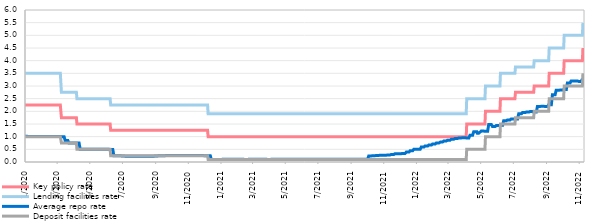
| Category | Key policy rate | Lending facilities rate | Average repo rate | Deposit facilities rate |
|---|---|---|---|---|
| 2020-01-03 | 2.25 | 3.5 | 1.02 | 1 |
| 2020-01-06 | 2.25 | 3.5 | 1.02 | 1 |
| 2020-01-08 | 2.25 | 3.5 | 1.01 | 1 |
| 2020-01-09 | 2.25 | 3.5 | 1.01 | 1 |
| 2020-01-10 | 2.25 | 3.5 | 1.01 | 1 |
| 2020-01-13 | 2.25 | 3.5 | 1.01 | 1 |
| 2020-01-14 | 2.25 | 3.5 | 1.01 | 1 |
| 2020-01-15 | 2.25 | 3.5 | 1.01 | 1 |
| 2020-01-16 | 2.25 | 3.5 | 1.01 | 1 |
| 2020-01-17 | 2.25 | 3.5 | 1.01 | 1 |
| 2020-01-20 | 2.25 | 3.5 | 1.01 | 1 |
| 2020-01-21 | 2.25 | 3.5 | 1.01 | 1 |
| 2020-01-22 | 2.25 | 3.5 | 1.01 | 1 |
| 2020-01-23 | 2.25 | 3.5 | 1.01 | 1 |
| 2020-01-24 | 2.25 | 3.5 | 1.01 | 1 |
| 2020-01-27 | 2.25 | 3.5 | 1.01 | 1 |
| 2020-01-28 | 2.25 | 3.5 | 1.01 | 1 |
| 2020-01-29 | 2.25 | 3.5 | 1.01 | 1 |
| 2020-01-30 | 2.25 | 3.5 | 1.01 | 1 |
| 2020-01-31 | 2.25 | 3.5 | 1.01 | 1 |
| 2020-02-03 | 2.25 | 3.5 | 1.01 | 1 |
| 2020-02-04 | 2.25 | 3.5 | 1.01 | 1 |
| 2020-02-05 | 2.25 | 3.5 | 1.01 | 1 |
| 2020-02-06 | 2.25 | 3.5 | 1.01 | 1 |
| 2020-02-07 | 2.25 | 3.5 | 1.01 | 1 |
| 2020-02-10 | 2.25 | 3.5 | 1.01 | 1 |
| 2020-02-11 | 2.25 | 3.5 | 1.01 | 1 |
| 2020-02-12 | 2.25 | 3.5 | 1.01 | 1 |
| 2020-02-13 | 2.25 | 3.5 | 1.01 | 1 |
| 2020-02-14 | 2.25 | 3.5 | 1.01 | 1 |
| 2020-02-18 | 2.25 | 3.5 | 1.01 | 1 |
| 2020-02-19 | 2.25 | 3.5 | 1.01 | 1 |
| 2020-02-20 | 2.25 | 3.5 | 1.01 | 1 |
| 2020-02-21 | 2.25 | 3.5 | 1.01 | 1 |
| 2020-02-24 | 2.25 | 3.5 | 1.01 | 1 |
| 2020-02-25 | 2.25 | 3.5 | 1.01 | 1 |
| 2020-02-26 | 2.25 | 3.5 | 1.01 | 1 |
| 2020-02-27 | 2.25 | 3.5 | 1.01 | 1 |
| 2020-02-28 | 2.25 | 3.5 | 1.01 | 1 |
| 2020-03-02 | 2.25 | 3.5 | 1.01 | 1 |
| 2020-03-03 | 2.25 | 3.5 | 1.01 | 1 |
| 2020-03-04 | 2.25 | 3.5 | 1.01 | 1 |
| 2020-03-05 | 2.25 | 3.5 | 1.01 | 1 |
| 2020-03-06 | 2.25 | 3.5 | 1.01 | 1 |
| 2020-03-09 | 2.25 | 3.5 | 1.01 | 1 |
| 2020-03-10 | 2.25 | 3.5 | 1.01 | 1 |
| 2020-03-11 | 1.75 | 2.75 | 1 | 0.75 |
| 2020-03-12 | 1.75 | 2.75 | 1 | 0.75 |
| 2020-03-13 | 1.75 | 2.75 | 1 | 0.75 |
| 2020-03-16 | 1.75 | 2.75 | 1 | 0.75 |
| 2020-03-17 | 1.75 | 2.75 | 1 | 0.75 |
| 2020-03-18 | 1.75 | 2.75 | 0.85 | 0.75 |
| 2020-03-19 | 1.75 | 2.75 | 0.85 | 0.75 |
| 2020-03-20 | 1.75 | 2.75 | 0.85 | 0.75 |
| 2020-03-23 | 1.75 | 2.75 | 0.85 | 0.75 |
| 2020-03-24 | 1.75 | 2.75 | 0.85 | 0.75 |
| 2020-03-25 | 1.75 | 2.75 | 0.75 | 0.75 |
| 2020-03-26 | 1.75 | 2.75 | 0.75 | 0.75 |
| 2020-03-27 | 1.75 | 2.75 | 0.75 | 0.75 |
| 2020-03-30 | 1.75 | 2.75 | 0.75 | 0.75 |
| 2020-03-31 | 1.75 | 2.75 | 0.75 | 0.75 |
| 2020-04-01 | 1.75 | 2.75 | 0.75 | 0.75 |
| 2020-04-02 | 1.75 | 2.75 | 0.75 | 0.75 |
| 2020-04-03 | 1.75 | 2.75 | 0.75 | 0.75 |
| 2020-04-06 | 1.75 | 2.75 | 0.75 | 0.75 |
| 2020-04-07 | 1.75 | 2.75 | 0.75 | 0.75 |
| 2020-04-08 | 1.75 | 2.75 | 0.75 | 0.75 |
| 2020-04-09 | 1.5 | 2.5 | 0.75 | 0.5 |
| 2020-04-10 | 1.5 | 2.5 | 0.75 | 0.5 |
| 2020-04-13 | 1.5 | 2.5 | 0.75 | 0.5 |
| 2020-04-14 | 1.5 | 2.5 | 0.75 | 0.5 |
| 2020-04-15 | 1.5 | 2.5 | 0.5 | 0.5 |
| 2020-04-16 | 1.5 | 2.5 | 0.5 | 0.5 |
| 2020-04-21 | 1.5 | 2.5 | 0.5 | 0.5 |
| 2020-04-22 | 1.5 | 2.5 | 0.5 | 0.5 |
| 2020-04-23 | 1.5 | 2.5 | 0.5 | 0.5 |
| 2020-04-24 | 1.5 | 2.5 | 0.5 | 0.5 |
| 2020-04-27 | 1.5 | 2.5 | 0.5 | 0.5 |
| 2020-04-28 | 1.5 | 2.5 | 0.5 | 0.5 |
| 2020-04-29 | 1.5 | 2.5 | 0.5 | 0.5 |
| 2020-04-30 | 1.5 | 2.5 | 0.5 | 0.5 |
| 2020-05-04 | 1.5 | 2.5 | 0.5 | 0.5 |
| 2020-05-05 | 1.5 | 2.5 | 0.5 | 0.5 |
| 2020-05-06 | 1.5 | 2.5 | 0.5 | 0.5 |
| 2020-05-07 | 1.5 | 2.5 | 0.5 | 0.5 |
| 2020-05-08 | 1.5 | 2.5 | 0.5 | 0.5 |
| 2020-05-11 | 1.5 | 2.5 | 0.5 | 0.5 |
| 2020-05-12 | 1.5 | 2.5 | 0.5 | 0.5 |
| 2020-05-13 | 1.5 | 2.5 | 0.5 | 0.5 |
| 2020-05-14 | 1.5 | 2.5 | 0.5 | 0.5 |
| 2020-05-15 | 1.5 | 2.5 | 0.5 | 0.5 |
| 2020-05-18 | 1.5 | 2.5 | 0.5 | 0.5 |
| 2020-05-19 | 1.5 | 2.5 | 0.5 | 0.5 |
| 2020-05-20 | 1.5 | 2.5 | 0.5 | 0.5 |
| 2020-05-21 | 1.5 | 2.5 | 0.5 | 0.5 |
| 2020-05-22 | 1.5 | 2.5 | 0.5 | 0.5 |
| 2020-05-25 | 1.5 | 2.5 | 0.5 | 0.5 |
| 2020-05-26 | 1.5 | 2.5 | 0.5 | 0.5 |
| 2020-05-27 | 1.5 | 2.5 | 0.5 | 0.5 |
| 2020-05-28 | 1.5 | 2.5 | 0.5 | 0.5 |
| 2020-05-29 | 1.5 | 2.5 | 0.5 | 0.5 |
| 2020-06-01 | 1.5 | 2.5 | 0.5 | 0.5 |
| 2020-06-02 | 1.5 | 2.5 | 0.5 | 0.5 |
| 2020-06-03 | 1.5 | 2.5 | 0.5 | 0.5 |
| 2020-06-04 | 1.5 | 2.5 | 0.5 | 0.5 |
| 2020-06-05 | 1.5 | 2.5 | 0.5 | 0.5 |
| 2020-06-08 | 1.5 | 2.5 | 0.5 | 0.5 |
| 2020-06-09 | 1.5 | 2.5 | 0.5 | 0.5 |
| 2020-06-10 | 1.5 | 2.5 | 0.49 | 0.5 |
| 2020-06-11 | 1.25 | 2.25 | 0.49 | 0.25 |
| 2020-06-12 | 1.25 | 2.25 | 0.49 | 0.25 |
| 2020-06-15 | 1.25 | 2.25 | 0.49 | 0.25 |
| 2020-06-16 | 1.25 | 2.25 | 0.49 | 0.25 |
| 2020-06-17 | 1.25 | 2.25 | 0.25 | 0.25 |
| 2020-06-18 | 1.25 | 2.25 | 0.25 | 0.25 |
| 2020-06-19 | 1.25 | 2.25 | 0.25 | 0.25 |
| 2020-06-22 | 1.25 | 2.25 | 0.25 | 0.25 |
| 2020-06-23 | 1.25 | 2.25 | 0.25 | 0.25 |
| 2020-06-24 | 1.25 | 2.25 | 0.25 | 0.25 |
| 2020-06-25 | 1.25 | 2.25 | 0.25 | 0.25 |
| 2020-06-26 | 1.25 | 2.25 | 0.25 | 0.25 |
| 2020-06-29 | 1.25 | 2.25 | 0.25 | 0.25 |
| 2020-06-30 | 1.25 | 2.25 | 0.25 | 0.25 |
| 2020-07-01 | 1.25 | 2.25 | 0.24 | 0.25 |
| 2020-07-02 | 1.25 | 2.25 | 0.24 | 0.25 |
| 2020-07-03 | 1.25 | 2.25 | 0.24 | 0.25 |
| 2020-07-06 | 1.25 | 2.25 | 0.24 | 0.25 |
| 2020-07-07 | 1.25 | 2.25 | 0.24 | 0.25 |
| 2020-07-08 | 1.25 | 2.25 | 0.23 | 0.25 |
| 2020-07-09 | 1.25 | 2.25 | 0.23 | 0.25 |
| 2020-07-10 | 1.25 | 2.25 | 0.23 | 0.25 |
| 2020-07-13 | 1.25 | 2.25 | 0.23 | 0.25 |
| 2020-07-14 | 1.25 | 2.25 | 0.23 | 0.25 |
| 2020-07-15 | 1.25 | 2.25 | 0.23 | 0.25 |
| 2020-07-16 | 1.25 | 2.25 | 0.23 | 0.25 |
| 2020-07-17 | 1.25 | 2.25 | 0.23 | 0.25 |
| 2020-07-20 | 1.25 | 2.25 | 0.23 | 0.25 |
| 2020-07-21 | 1.25 | 2.25 | 0.23 | 0.25 |
| 2020-07-22 | 1.25 | 2.25 | 0.23 | 0.25 |
| 2020-07-23 | 1.25 | 2.25 | 0.23 | 0.25 |
| 2020-07-24 | 1.25 | 2.25 | 0.23 | 0.25 |
| 2020-07-27 | 1.25 | 2.25 | 0.23 | 0.25 |
| 2020-07-28 | 1.25 | 2.25 | 0.23 | 0.25 |
| 2020-07-29 | 1.25 | 2.25 | 0.23 | 0.25 |
| 2020-07-30 | 1.25 | 2.25 | 0.23 | 0.25 |
| 2020-07-31 | 1.25 | 2.25 | 0.23 | 0.25 |
| 2020-08-03 | 1.25 | 2.25 | 0.23 | 0.25 |
| 2020-08-04 | 1.25 | 2.25 | 0.23 | 0.25 |
| 2020-08-05 | 1.25 | 2.25 | 0.23 | 0.25 |
| 2020-08-06 | 1.25 | 2.25 | 0.23 | 0.25 |
| 2020-08-07 | 1.25 | 2.25 | 0.23 | 0.25 |
| 2020-08-10 | 1.25 | 2.25 | 0.23 | 0.25 |
| 2020-08-11 | 1.25 | 2.25 | 0.23 | 0.25 |
| 2020-08-12 | 1.25 | 2.25 | 0.23 | 0.25 |
| 2020-08-13 | 1.25 | 2.25 | 0.23 | 0.25 |
| 2020-08-14 | 1.25 | 2.25 | 0.23 | 0.25 |
| 2020-08-17 | 1.25 | 2.25 | 0.23 | 0.25 |
| 2020-08-18 | 1.25 | 2.25 | 0.23 | 0.25 |
| 2020-08-19 | 1.25 | 2.25 | 0.23 | 0.25 |
| 2020-08-20 | 1.25 | 2.25 | 0.23 | 0.25 |
| 2020-08-21 | 1.25 | 2.25 | 0.23 | 0.25 |
| 2020-08-24 | 1.25 | 2.25 | 0.23 | 0.25 |
| 2020-08-25 | 1.25 | 2.25 | 0.23 | 0.25 |
| 2020-08-26 | 1.25 | 2.25 | 0.23 | 0.25 |
| 2020-08-27 | 1.25 | 2.25 | 0.23 | 0.25 |
| 2020-08-28 | 1.25 | 2.25 | 0.23 | 0.25 |
| 2020-08-31 | 1.25 | 2.25 | 0.23 | 0.25 |
| 2020-09-01 | 1.25 | 2.25 | 0.23 | 0.25 |
| 2020-09-02 | 1.25 | 2.25 | 0.24 | 0.25 |
| 2020-09-03 | 1.25 | 2.25 | 0.24 | 0.25 |
| 2020-09-04 | 1.25 | 2.25 | 0.24 | 0.25 |
| 2020-09-07 | 1.25 | 2.25 | 0.24 | 0.25 |
| 2020-09-08 | 1.25 | 2.25 | 0.24 | 0.25 |
| 2020-09-09 | 1.25 | 2.25 | 0.25 | 0.25 |
| 2020-09-10 | 1.25 | 2.25 | 0.25 | 0.25 |
| 2020-09-11 | 1.25 | 2.25 | 0.25 | 0.25 |
| 2020-09-14 | 1.25 | 2.25 | 0.25 | 0.25 |
| 2020-09-15 | 1.25 | 2.25 | 0.25 | 0.25 |
| 2020-09-16 | 1.25 | 2.25 | 0.25 | 0.25 |
| 2020-09-17 | 1.25 | 2.25 | 0.25 | 0.25 |
| 2020-09-18 | 1.25 | 2.25 | 0.25 | 0.25 |
| 2020-09-21 | 1.25 | 2.25 | 0.25 | 0.25 |
| 2020-09-22 | 1.25 | 2.25 | 0.25 | 0.25 |
| 2020-09-23 | 1.25 | 2.25 | 0.26 | 0.25 |
| 2020-09-24 | 1.25 | 2.25 | 0.26 | 0.25 |
| 2020-09-25 | 1.25 | 2.25 | 0.26 | 0.25 |
| 2020-09-28 | 1.25 | 2.25 | 0.26 | 0.25 |
| 2020-09-29 | 1.25 | 2.25 | 0.26 | 0.25 |
| 2020-09-30 | 1.25 | 2.25 | 0.26 | 0.25 |
| 2020-10-01 | 1.25 | 2.25 | 0.26 | 0.25 |
| 2020-10-02 | 1.25 | 2.25 | 0.26 | 0.25 |
| 2020-10-05 | 1.25 | 2.25 | 0.26 | 0.25 |
| 2020-10-06 | 1.25 | 2.25 | 0.26 | 0.25 |
| 2020-10-07 | 1.25 | 2.25 | 0.26 | 0.25 |
| 2020-10-08 | 1.25 | 2.25 | 0.26 | 0.25 |
| 2020-10-09 | 1.25 | 2.25 | 0.26 | 0.25 |
| 2020-10-12 | 1.25 | 2.25 | 0.26 | 0.25 |
| 2020-10-13 | 1.25 | 2.25 | 0.26 | 0.25 |
| 2020-10-14 | 1.25 | 2.25 | 0.26 | 0.25 |
| 2020-10-15 | 1.25 | 2.25 | 0.26 | 0.25 |
| 2020-10-16 | 1.25 | 2.25 | 0.26 | 0.25 |
| 2020-10-19 | 1.25 | 2.25 | 0.26 | 0.25 |
| 2020-10-20 | 1.25 | 2.25 | 0.26 | 0.25 |
| 2020-10-21 | 1.25 | 2.25 | 0.26 | 0.25 |
| 2020-10-22 | 1.25 | 2.25 | 0.26 | 0.25 |
| 2020-10-23 | 1.25 | 2.25 | 0.26 | 0.25 |
| 2020-10-26 | 1.25 | 2.25 | 0.26 | 0.25 |
| 2020-10-27 | 1.25 | 2.25 | 0.26 | 0.25 |
| 2020-10-28 | 1.25 | 2.25 | 0.26 | 0.25 |
| 2020-10-29 | 1.25 | 2.25 | 0.26 | 0.25 |
| 2020-10-30 | 1.25 | 2.25 | 0.26 | 0.25 |
| 2020-11-02 | 1.25 | 2.25 | 0.26 | 0.25 |
| 2020-11-03 | 1.25 | 2.25 | 0.26 | 0.25 |
| 2020-11-04 | 1.25 | 2.25 | 0.26 | 0.25 |
| 2020-11-05 | 1.25 | 2.25 | 0.26 | 0.25 |
| 2020-11-06 | 1.25 | 2.25 | 0.26 | 0.25 |
| 2020-11-09 | 1.25 | 2.25 | 0.26 | 0.25 |
| 2020-11-10 | 1.25 | 2.25 | 0.26 | 0.25 |
| 2020-11-12 | 1.25 | 2.25 | 0.26 | 0.25 |
| 2020-11-13 | 1.25 | 2.25 | 0.26 | 0.25 |
| 2020-11-16 | 1.25 | 2.25 | 0.26 | 0.25 |
| 2020-11-17 | 1.25 | 2.25 | 0.26 | 0.25 |
| 2020-11-18 | 1.25 | 2.25 | 0.26 | 0.25 |
| 2020-11-19 | 1.25 | 2.25 | 0.26 | 0.25 |
| 2020-11-20 | 1.25 | 2.25 | 0.26 | 0.25 |
| 2020-11-23 | 1.25 | 2.25 | 0.26 | 0.25 |
| 2020-11-24 | 1.25 | 2.25 | 0.26 | 0.25 |
| 2020-11-25 | 1.25 | 2.25 | 0.26 | 0.25 |
| 2020-11-26 | 1.25 | 2.25 | 0.26 | 0.25 |
| 2020-11-27 | 1.25 | 2.25 | 0.26 | 0.25 |
| 2020-11-30 | 1.25 | 2.25 | 0.26 | 0.25 |
| 2020-12-01 | 1.25 | 2.25 | 0.26 | 0.25 |
| 2020-12-02 | 1.25 | 2.25 | 0.25 | 0.25 |
| 2020-12-03 | 1.25 | 2.25 | 0.25 | 0.25 |
| 2020-12-04 | 1.25 | 2.25 | 0.25 | 0.25 |
| 2020-12-07 | 1.25 | 2.25 | 0.25 | 0.25 |
| 2020-12-08 | 1.25 | 2.25 | 0.25 | 0.25 |
| 2020-12-09 | 1.25 | 2.25 | 0.25 | 0.25 |
| 2020-12-10 | 1 | 1.9 | 0.25 | 0.1 |
| 2020-12-11 | 1 | 1.9 | 0.25 | 0.1 |
| 2020-12-14 | 1 | 1.9 | 0.25 | 0.1 |
| 2020-12-15 | 1 | 1.9 | 0.25 | 0.1 |
| 2020-12-16 | 1 | 1.9 | 0.1 | 0.1 |
| 2020-12-17 | 1 | 1.9 | 0.1 | 0.1 |
| 2020-12-18 | 1 | 1.9 | 0.1 | 0.1 |
| 2020-12-21 | 1 | 1.9 | 0.1 | 0.1 |
| 2020-12-22 | 1 | 1.9 | 0.1 | 0.1 |
| 2020-12-23 | 1 | 1.9 | 0.1 | 0.1 |
| 2020-12-24 | 1 | 1.9 | 0.1 | 0.1 |
| 2020-12-25 | 1 | 1.9 | 0.1 | 0.1 |
| 2020-12-28 | 1 | 1.9 | 0.1 | 0.1 |
| 2020-12-29 | 1 | 1.9 | 0.1 | 0.1 |
| 2020-12-30 | 1 | 1.9 | 0.1 | 0.1 |
| 2020-12-31 | 1 | 1.9 | 0.1 | 0.1 |
| 2021-01-04 | 1 | 1.9 | 0.1 | 0.1 |
| 2021-01-05 | 1 | 1.9 | 0.1 | 0.1 |
| 2021-01-06 | 1 | 1.9 | 0.11 | 0.1 |
| 2021-01-08 | 1 | 1.9 | 0.11 | 0.1 |
| 2021-01-11 | 1 | 1.9 | 0.11 | 0.1 |
| 2021-01-12 | 1 | 1.9 | 0.11 | 0.1 |
| 2021-01-13 | 1 | 1.9 | 0.11 | 0.1 |
| 2021-01-14 | 1 | 1.9 | 0.11 | 0.1 |
| 2021-01-15 | 1 | 1.9 | 0.11 | 0.1 |
| 2021-01-18 | 1 | 1.9 | 0.11 | 0.1 |
| 2021-01-19 | 1 | 1.9 | 0.11 | 0.1 |
| 2021-01-20 | 1 | 1.9 | 0.11 | 0.1 |
| 2021-01-21 | 1 | 1.9 | 0.11 | 0.1 |
| 2021-01-22 | 1 | 1.9 | 0.11 | 0.1 |
| 2021-01-25 | 1 | 1.9 | 0.11 | 0.1 |
| 2021-01-26 | 1 | 1.9 | 0.11 | 0.1 |
| 2021-01-27 | 1 | 1.9 | 0.11 | 0.1 |
| 2021-01-28 | 1 | 1.9 | 0.11 | 0.1 |
| 2021-01-29 | 1 | 1.9 | 0.11 | 0.1 |
| 2021-02-01 | 1 | 1.9 | 0.11 | 0.1 |
| 2021-02-02 | 1 | 1.9 | 0.11 | 0.1 |
| 2021-02-03 | 1 | 1.9 | 0.11 | 0.1 |
| 2021-02-04 | 1 | 1.9 | 0.11 | 0.1 |
| 2021-02-05 | 1 | 1.9 | 0.11 | 0.1 |
| 2021-02-08 | 1 | 1.9 | 0.11 | 0.1 |
| 2021-02-09 | 1 | 1.9 | 0.11 | 0.1 |
| 2021-02-10 | 1 | 1.9 | 0.11 | 0.1 |
| 2021-02-11 | 1 | 1.9 | 0.11 | 0.1 |
| 2021-02-12 | 1 | 1.9 | 0.11 | 0.1 |
| 2021-02-17 | 1 | 1.9 | 0.1 | 0.1 |
| 2021-02-18 | 1 | 1.9 | 0.1 | 0.1 |
| 2021-02-19 | 1 | 1.9 | 0.1 | 0.1 |
| 2021-02-22 | 1 | 1.9 | 0.1 | 0.1 |
| 2021-02-23 | 1 | 1.9 | 0.1 | 0.1 |
| 2021-02-24 | 1 | 1.9 | 0.11 | 0.1 |
| 2021-02-25 | 1 | 1.9 | 0.11 | 0.1 |
| 2021-02-26 | 1 | 1.9 | 0.11 | 0.1 |
| 2021-03-01 | 1 | 1.9 | 0.11 | 0.1 |
| 2021-03-02 | 1 | 1.9 | 0.11 | 0.1 |
| 2021-03-03 | 1 | 1.9 | 0.11 | 0.1 |
| 2021-03-04 | 1 | 1.9 | 0.11 | 0.1 |
| 2021-03-05 | 1 | 1.9 | 0.11 | 0.1 |
| 2021-03-08 | 1 | 1.9 | 0.11 | 0.1 |
| 2021-03-09 | 1 | 1.9 | 0.11 | 0.1 |
| 2021-03-10 | 1 | 1.9 | 0.11 | 0.1 |
| 2021-03-11 | 1 | 1.9 | 0.11 | 0.1 |
| 2021-03-12 | 1 | 1.9 | 0.11 | 0.1 |
| 2021-03-15 | 1 | 1.9 | 0.11 | 0.1 |
| 2021-03-16 | 1 | 1.9 | 0.11 | 0.1 |
| 2021-03-17 | 1 | 1.9 | 0.11 | 0.1 |
| 2021-03-18 | 1 | 1.9 | 0.11 | 0.1 |
| 2021-03-19 | 1 | 1.9 | 0.11 | 0.1 |
| 2021-03-22 | 1 | 1.9 | 0.11 | 0.1 |
| 2021-03-23 | 1 | 1.9 | 0.11 | 0.1 |
| 2021-03-24 | 1 | 1.9 | 0.11 | 0.1 |
| 2021-03-25 | 1 | 1.9 | 0.11 | 0.1 |
| 2021-03-26 | 1 | 1.9 | 0.11 | 0.1 |
| 2021-03-29 | 1 | 1.9 | 0.11 | 0.1 |
| 2021-03-30 | 1 | 1.9 | 0.11 | 0.1 |
| 2021-03-31 | 1 | 1.9 | 0.1 | 0.1 |
| 2021-04-01 | 1 | 1.9 | 0.1 | 0.1 |
| 2021-04-02 | 1 | 1.9 | 0.1 | 0.1 |
| 2021-04-05 | 1 | 1.9 | 0.1 | 0.1 |
| 2021-04-06 | 1 | 1.9 | 0.1 | 0.1 |
| 2021-04-07 | 1 | 1.9 | 0.11 | 0.1 |
| 2021-04-08 | 1 | 1.9 | 0.11 | 0.1 |
| 2021-04-09 | 1 | 1.9 | 0.11 | 0.1 |
| 2021-04-12 | 1 | 1.9 | 0.11 | 0.1 |
| 2021-04-13 | 1 | 1.9 | 0.11 | 0.1 |
| 2021-04-14 | 1 | 1.9 | 0.11 | 0.1 |
| 2021-04-15 | 1 | 1.9 | 0.11 | 0.1 |
| 2021-04-16 | 1 | 1.9 | 0.11 | 0.1 |
| 2021-04-19 | 1 | 1.9 | 0.11 | 0.1 |
| 2021-04-20 | 1 | 1.9 | 0.11 | 0.1 |
| 2021-04-21 | 1 | 1.9 | 0.11 | 0.1 |
| 2021-04-22 | 1 | 1.9 | 0.11 | 0.1 |
| 2021-04-23 | 1 | 1.9 | 0.11 | 0.1 |
| 2021-04-26 | 1 | 1.9 | 0.11 | 0.1 |
| 2021-04-27 | 1 | 1.9 | 0.11 | 0.1 |
| 2021-04-28 | 1 | 1.9 | 0.11 | 0.1 |
| 2021-04-29 | 1 | 1.9 | 0.11 | 0.1 |
| 2021-05-05 | 1 | 1.9 | 0.11 | 0.1 |
| 2021-05-06 | 1 | 1.9 | 0.11 | 0.1 |
| 2021-05-07 | 1 | 1.9 | 0.11 | 0.1 |
| 2021-05-10 | 1 | 1.9 | 0.11 | 0.1 |
| 2021-05-11 | 1 | 1.9 | 0.11 | 0.1 |
| 2021-05-12 | 1 | 1.9 | 0.11 | 0.1 |
| 2021-05-13 | 1 | 1.9 | 0.11 | 0.1 |
| 2021-05-14 | 1 | 1.9 | 0.11 | 0.1 |
| 2021-05-17 | 1 | 1.9 | 0.11 | 0.1 |
| 2021-05-18 | 1 | 1.9 | 0.11 | 0.1 |
| 2021-05-19 | 1 | 1.9 | 0.11 | 0.1 |
| 2021-05-20 | 1 | 1.9 | 0.11 | 0.1 |
| 2021-05-21 | 1 | 1.9 | 0.11 | 0.1 |
| 2021-05-24 | 1 | 1.9 | 0.11 | 0.1 |
| 2021-05-25 | 1 | 1.9 | 0.11 | 0.1 |
| 2021-05-26 | 1 | 1.9 | 0.11 | 0.1 |
| 2021-05-27 | 1 | 1.9 | 0.11 | 0.1 |
| 2021-05-28 | 1 | 1.9 | 0.11 | 0.1 |
| 2021-05-31 | 1 | 1.9 | 0.11 | 0.1 |
| 2021-06-01 | 1 | 1.9 | 0.11 | 0.1 |
| 2021-06-02 | 1 | 1.9 | 0.11 | 0.1 |
| 2021-06-03 | 1 | 1.9 | 0.11 | 0.1 |
| 2021-06-04 | 1 | 1.9 | 0.11 | 0.1 |
| 2021-06-07 | 1 | 1.9 | 0.11 | 0.1 |
| 2021-06-08 | 1 | 1.9 | 0.11 | 0.1 |
| 2021-06-09 | 1 | 1.9 | 0.11 | 0.1 |
| 2021-06-10 | 1 | 1.9 | 0.11 | 0.1 |
| 2021-06-11 | 1 | 1.9 | 0.11 | 0.1 |
| 2021-06-14 | 1 | 1.9 | 0.11 | 0.1 |
| 2021-06-15 | 1 | 1.9 | 0.11 | 0.1 |
| 2021-06-16 | 1 | 1.9 | 0.11 | 0.1 |
| 2021-06-17 | 1 | 1.9 | 0.11 | 0.1 |
| 2021-06-18 | 1 | 1.9 | 0.11 | 0.1 |
| 2021-06-21 | 1 | 1.9 | 0.11 | 0.1 |
| 2021-06-22 | 1 | 1.9 | 0.11 | 0.1 |
| 2021-06-23 | 1 | 1.9 | 0.11 | 0.1 |
| 2021-06-24 | 1 | 1.9 | 0.11 | 0.1 |
| 2021-06-25 | 1 | 1.9 | 0.11 | 0.1 |
| 2021-06-28 | 1 | 1.9 | 0.11 | 0.1 |
| 2021-06-29 | 1 | 1.9 | 0.11 | 0.1 |
| 2021-06-30 | 1 | 1.9 | 0.11 | 0.1 |
| 2021-07-01 | 1 | 1.9 | 0.11 | 0.1 |
| 2021-07-02 | 1 | 1.9 | 0.11 | 0.1 |
| 2021-07-05 | 1 | 1.9 | 0.11 | 0.1 |
| 2021-07-06 | 1 | 1.9 | 0.11 | 0.1 |
| 2021-07-07 | 1 | 1.9 | 0.11 | 0.1 |
| 2021-07-08 | 1 | 1.9 | 0.11 | 0.1 |
| 2021-07-09 | 1 | 1.9 | 0.11 | 0.1 |
| 2021-07-12 | 1 | 1.9 | 0.11 | 0.1 |
| 2021-07-13 | 1 | 1.9 | 0.11 | 0.1 |
| 2021-07-14 | 1 | 1.9 | 0.11 | 0.1 |
| 2021-07-15 | 1 | 1.9 | 0.11 | 0.1 |
| 2021-07-16 | 1 | 1.9 | 0.11 | 0.1 |
| 2021-07-19 | 1 | 1.9 | 0.11 | 0.1 |
| 2021-07-20 | 1 | 1.9 | 0.11 | 0.1 |
| 2021-07-21 | 1 | 1.9 | 0.11 | 0.1 |
| 2021-07-22 | 1 | 1.9 | 0.11 | 0.1 |
| 2021-07-23 | 1 | 1.9 | 0.11 | 0.1 |
| 2021-07-26 | 1 | 1.9 | 0.11 | 0.1 |
| 2021-07-27 | 1 | 1.9 | 0.11 | 0.1 |
| 2021-07-28 | 1 | 1.9 | 0.11 | 0.1 |
| 2021-07-29 | 1 | 1.9 | 0.11 | 0.1 |
| 2021-07-30 | 1 | 1.9 | 0.11 | 0.1 |
| 2021-08-02 | 1 | 1.9 | 0.11 | 0.1 |
| 2021-08-03 | 1 | 1.9 | 0.11 | 0.1 |
| 2021-08-04 | 1 | 1.9 | 0.11 | 0.1 |
| 2021-08-05 | 1 | 1.9 | 0.11 | 0.1 |
| 2021-08-06 | 1 | 1.9 | 0.11 | 0.1 |
| 2021-08-09 | 1 | 1.9 | 0.11 | 0.1 |
| 2021-08-10 | 1 | 1.9 | 0.11 | 0.1 |
| 2021-08-11 | 1 | 1.9 | 0.11 | 0.1 |
| 2021-08-12 | 1 | 1.9 | 0.11 | 0.1 |
| 2021-08-13 | 1 | 1.9 | 0.11 | 0.1 |
| 2021-08-16 | 1 | 1.9 | 0.11 | 0.1 |
| 2021-08-17 | 1 | 1.9 | 0.11 | 0.1 |
| 2021-08-18 | 1 | 1.9 | 0.11 | 0.1 |
| 2021-08-19 | 1 | 1.9 | 0.11 | 0.1 |
| 2021-08-20 | 1 | 1.9 | 0.11 | 0.1 |
| 2021-08-23 | 1 | 1.9 | 0.11 | 0.1 |
| 2021-08-24 | 1 | 1.9 | 0.11 | 0.1 |
| 2021-08-25 | 1 | 1.9 | 0.11 | 0.1 |
| 2021-08-26 | 1 | 1.9 | 0.11 | 0.1 |
| 2021-08-27 | 1 | 1.9 | 0.11 | 0.1 |
| 2021-08-30 | 1 | 1.9 | 0.11 | 0.1 |
| 2021-08-31 | 1 | 1.9 | 0.11 | 0.1 |
| 2021-09-01 | 1 | 1.9 | 0.11 | 0.1 |
| 2021-09-02 | 1 | 1.9 | 0.11 | 0.1 |
| 2021-09-03 | 1 | 1.9 | 0.11 | 0.1 |
| 2021-09-06 | 1 | 1.9 | 0.11 | 0.1 |
| 2021-09-07 | 1 | 1.9 | 0.11 | 0.1 |
| 2021-09-08 | 1 | 1.9 | 0.11 | 0.1 |
| 2021-09-09 | 1 | 1.9 | 0.11 | 0.1 |
| 2021-09-10 | 1 | 1.9 | 0.11 | 0.1 |
| 2021-09-13 | 1 | 1.9 | 0.11 | 0.1 |
| 2021-09-14 | 1 | 1.9 | 0.11 | 0.1 |
| 2021-09-15 | 1 | 1.9 | 0.11 | 0.1 |
| 2021-09-16 | 1 | 1.9 | 0.11 | 0.1 |
| 2021-09-17 | 1 | 1.9 | 0.11 | 0.1 |
| 2021-09-20 | 1 | 1.9 | 0.11 | 0.1 |
| 2021-09-21 | 1 | 1.9 | 0.11 | 0.1 |
| 2021-09-22 | 1 | 1.9 | 0.11 | 0.1 |
| 2021-09-23 | 1 | 1.9 | 0.11 | 0.1 |
| 2021-09-24 | 1 | 1.9 | 0.11 | 0.1 |
| 2021-09-27 | 1 | 1.9 | 0.11 | 0.1 |
| 2021-09-28 | 1 | 1.9 | 0.11 | 0.1 |
| 2021-09-29 | 1 | 1.9 | 0.11 | 0.1 |
| 2021-09-30 | 1 | 1.9 | 0.11 | 0.1 |
| 2021-10-01 | 1 | 1.9 | 0.11 | 0.1 |
| 2021-10-04 | 1 | 1.9 | 0.11 | 0.1 |
| 2021-10-05 | 1 | 1.9 | 0.11 | 0.1 |
| 2021-10-06 | 1 | 1.9 | 0.24 | 0.1 |
| 2021-10-07 | 1 | 1.9 | 0.24 | 0.1 |
| 2021-10-08 | 1 | 1.9 | 0.24 | 0.1 |
| 2021-10-11 | 1 | 1.9 | 0.24 | 0.1 |
| 2021-10-12 | 1 | 1.9 | 0.24 | 0.1 |
| 2021-10-13 | 1 | 1.9 | 0.25 | 0.1 |
| 2021-10-14 | 1 | 1.9 | 0.25 | 0.1 |
| 2021-10-15 | 1 | 1.9 | 0.25 | 0.1 |
| 2021-10-18 | 1 | 1.9 | 0.25 | 0.1 |
| 2021-10-19 | 1 | 1.9 | 0.25 | 0.1 |
| 2021-10-20 | 1 | 1.9 | 0.26 | 0.1 |
| 2021-10-21 | 1 | 1.9 | 0.26 | 0.1 |
| 2021-10-22 | 1 | 1.9 | 0.26 | 0.1 |
| 2021-10-25 | 1 | 1.9 | 0.26 | 0.1 |
| 2021-10-26 | 1 | 1.9 | 0.26 | 0.1 |
| 2021-10-27 | 1 | 1.9 | 0.27 | 0.1 |
| 2021-10-28 | 1 | 1.9 | 0.27 | 0.1 |
| 2021-10-29 | 1 | 1.9 | 0.27 | 0.1 |
| 2021-11-01 | 1 | 1.9 | 0.27 | 0.1 |
| 2021-11-02 | 1 | 1.9 | 0.27 | 0.1 |
| 2021-11-03 | 1 | 1.9 | 0.27 | 0.1 |
| 2021-11-04 | 1 | 1.9 | 0.27 | 0.1 |
| 2021-11-05 | 1 | 1.9 | 0.27 | 0.1 |
| 2021-11-08 | 1 | 1.9 | 0.27 | 0.1 |
| 2021-11-09 | 1 | 1.9 | 0.27 | 0.1 |
| 2021-11-10 | 1 | 1.9 | 0.28 | 0.1 |
| 2021-11-12 | 1 | 1.9 | 0.28 | 0.1 |
| 2021-11-15 | 1 | 1.9 | 0.28 | 0.1 |
| 2021-11-16 | 1 | 1.9 | 0.28 | 0.1 |
| 2021-11-17 | 1 | 1.9 | 0.3 | 0.1 |
| 2021-11-18 | 1 | 1.9 | 0.3 | 0.1 |
| 2021-11-19 | 1 | 1.9 | 0.3 | 0.1 |
| 2021-11-22 | 1 | 1.9 | 0.3 | 0.1 |
| 2021-11-23 | 1 | 1.9 | 0.3 | 0.1 |
| 2021-11-24 | 1 | 1.9 | 0.33 | 0.1 |
| 2021-11-25 | 1 | 1.9 | 0.33 | 0.1 |
| 2021-11-26 | 1 | 1.9 | 0.33 | 0.1 |
| 2021-11-29 | 1 | 1.9 | 0.33 | 0.1 |
| 2021-11-30 | 1 | 1.9 | 0.33 | 0.1 |
| 2021-12-01 | 1 | 1.9 | 0.33 | 0.1 |
| 2021-12-02 | 1 | 1.9 | 0.33 | 0.1 |
| 2021-12-03 | 1 | 1.9 | 0.33 | 0.1 |
| 2021-12-06 | 1 | 1.9 | 0.33 | 0.1 |
| 2021-12-07 | 1 | 1.9 | 0.33 | 0.1 |
| 2021-12-08 | 1 | 1.9 | 0.34 | 0.1 |
| 2021-12-09 | 1 | 1.9 | 0.34 | 0.1 |
| 2021-12-10 | 1 | 1.9 | 0.34 | 0.1 |
| 2021-12-13 | 1 | 1.9 | 0.34 | 0.1 |
| 2021-12-14 | 1 | 1.9 | 0.34 | 0.1 |
| 2021-12-15 | 1 | 1.9 | 0.39 | 0.1 |
| 2021-12-16 | 1 | 1.9 | 0.39 | 0.1 |
| 2021-12-17 | 1 | 1.9 | 0.39 | 0.1 |
| 2021-12-20 | 1 | 1.9 | 0.39 | 0.1 |
| 2021-12-21 | 1 | 1.9 | 0.39 | 0.1 |
| 2021-12-22 | 1 | 1.9 | 0.44 | 0.1 |
| 2021-12-23 | 1 | 1.9 | 0.44 | 0.1 |
| 2021-12-24 | 1 | 1.9 | 0.44 | 0.1 |
| 2021-12-27 | 1 | 1.9 | 0.44 | 0.1 |
| 2021-12-28 | 1 | 1.9 | 0.44 | 0.1 |
| 2021-12-29 | 1 | 1.9 | 0.5 | 0.1 |
| 2021-12-30 | 1 | 1.9 | 0.5 | 0.1 |
| 2021-12-31 | 1 | 1.9 | 0.5 | 0.1 |
| 2022-01-04 | 1 | 1.9 | 0.5 | 0.1 |
| 2022-01-05 | 1 | 1.9 | 0.5 | 0.1 |
| 2022-01-06 | 1 | 1.9 | 0.5 | 0.1 |
| 2022-01-10 | 1 | 1.9 | 0.5 | 0.1 |
| 2022-01-11 | 1 | 1.9 | 0.5 | 0.1 |
| 2022-01-12 | 1 | 1.9 | 0.59 | 0.1 |
| 2022-01-13 | 1 | 1.9 | 0.59 | 0.1 |
| 2022-01-14 | 1 | 1.9 | 0.59 | 0.1 |
| 2022-01-17 | 1 | 1.9 | 0.59 | 0.1 |
| 2022-01-18 | 1 | 1.9 | 0.59 | 0.1 |
| 2022-01-19 | 1 | 1.9 | 0.63 | 0.1 |
| 2022-01-20 | 1 | 1.9 | 0.63 | 0.1 |
| 2022-01-21 | 1 | 1.9 | 0.63 | 0.1 |
| 2022-01-24 | 1 | 1.9 | 0.63 | 0.1 |
| 2022-01-25 | 1 | 1.9 | 0.63 | 0.1 |
| 2022-01-26 | 1 | 1.9 | 0.67 | 0.1 |
| 2022-01-27 | 1 | 1.9 | 0.67 | 0.1 |
| 2022-01-28 | 1 | 1.9 | 0.67 | 0.1 |
| 2022-01-31 | 1 | 1.9 | 0.67 | 0.1 |
| 2022-02-01 | 1 | 1.9 | 0.67 | 0.1 |
| 2022-02-02 | 1 | 1.9 | 0.71 | 0.1 |
| 2022-02-03 | 1 | 1.9 | 0.71 | 0.1 |
| 2022-02-04 | 1 | 1.9 | 0.71 | 0.1 |
| 2022-02-07 | 1 | 1.9 | 0.71 | 0.1 |
| 2022-02-08 | 1 | 1.9 | 0.71 | 0.1 |
| 2022-02-09 | 1 | 1.9 | 0.75 | 0.1 |
| 2022-02-10 | 1 | 1.9 | 0.75 | 0.1 |
| 2022-02-11 | 1 | 1.9 | 0.75 | 0.1 |
| 2022-02-14 | 1 | 1.9 | 0.75 | 0.1 |
| 2022-02-17 | 1 | 1.9 | 0.79 | 0.1 |
| 2022-02-18 | 1 | 1.9 | 0.79 | 0.1 |
| 2022-02-21 | 1 | 1.9 | 0.79 | 0.1 |
| 2022-02-22 | 1 | 1.9 | 0.79 | 0.1 |
| 2022-02-23 | 1 | 1.9 | 0.83 | 0.1 |
| 2022-02-24 | 1 | 1.9 | 0.83 | 0.1 |
| 2022-02-25 | 1 | 1.9 | 0.83 | 0.1 |
| 2022-02-28 | 1 | 1.9 | 0.83 | 0.1 |
| 2022-03-01 | 1 | 1.9 | 0.83 | 0.1 |
| 2022-03-02 | 1 | 1.9 | 0.86 | 0.1 |
| 2022-03-03 | 1 | 1.9 | 0.86 | 0.1 |
| 2022-03-04 | 1 | 1.9 | 0.86 | 0.1 |
| 2022-03-07 | 1 | 1.9 | 0.86 | 0.1 |
| 2022-03-08 | 1 | 1.9 | 0.86 | 0.1 |
| 2022-03-09 | 1 | 1.9 | 0.9 | 0.1 |
| 2022-03-10 | 1 | 1.9 | 0.9 | 0.1 |
| 2022-03-11 | 1 | 1.9 | 0.9 | 0.1 |
| 2022-03-14 | 1 | 1.9 | 0.9 | 0.1 |
| 2022-03-15 | 1 | 1.9 | 0.9 | 0.1 |
| 2022-03-16 | 1 | 1.9 | 0.93 | 0.1 |
| 2022-03-17 | 1 | 1.9 | 0.93 | 0.1 |
| 2022-03-18 | 1 | 1.9 | 0.93 | 0.1 |
| 2022-03-21 | 1 | 1.9 | 0.93 | 0.1 |
| 2022-03-22 | 1 | 1.9 | 0.93 | 0.1 |
| 2022-03-23 | 1 | 1.9 | 0.95 | 0.1 |
| 2022-03-24 | 1 | 1.9 | 0.95 | 0.1 |
| 2022-03-25 | 1 | 1.9 | 0.95 | 0.1 |
| 2022-03-28 | 1 | 1.9 | 0.95 | 0.1 |
| 2022-03-29 | 1 | 1.9 | 0.95 | 0.1 |
| 2022-03-30 | 1 | 1.9 | 0.96 | 0.1 |
| 2022-03-31 | 1 | 1.9 | 0.96 | 0.1 |
| 2022-04-01 | 1 | 1.9 | 0.96 | 0.1 |
| 2022-04-04 | 1 | 1.9 | 0.96 | 0.1 |
| 2022-04-05 | 1 | 1.9 | 0.96 | 0.1 |
| 2022-04-06 | 1 | 1.9 | 0.95 | 0.1 |
| 2022-04-07 | 1.5 | 2.5 | 0.95 | 0.5 |
| 2022-04-08 | 1.5 | 2.5 | 0.95 | 0.5 |
| 2022-04-11 | 1.5 | 2.5 | 0.95 | 0.5 |
| 2022-04-12 | 1.5 | 2.5 | 0.95 | 0.5 |
| 2022-04-13 | 1.5 | 2.5 | 1.06 | 0.5 |
| 2022-04-14 | 1.5 | 2.5 | 1.06 | 0.5 |
| 2022-04-15 | 1.5 | 2.5 | 1.06 | 0.5 |
| 2022-04-18 | 1.5 | 2.5 | 1.06 | 0.5 |
| 2022-04-19 | 1.5 | 2.5 | 1.06 | 0.5 |
| 2022-04-20 | 1.5 | 2.5 | 1.19 | 0.5 |
| 2022-04-21 | 1.5 | 2.5 | 1.19 | 0.5 |
| 2022-04-26 | 1.5 | 2.5 | 1.19 | 0.5 |
| 2022-04-27 | 1.5 | 2.5 | 1.13 | 0.5 |
| 2022-04-28 | 1.5 | 2.5 | 1.13 | 0.5 |
| 2022-04-29 | 1.5 | 2.5 | 1.13 | 0.5 |
| 2022-05-04 | 1.5 | 2.5 | 1.22 | 0.5 |
| 2022-05-05 | 1.5 | 2.5 | 1.22 | 0.5 |
| 2022-05-06 | 1.5 | 2.5 | 1.22 | 0.5 |
| 2022-05-09 | 1.5 | 2.5 | 1.22 | 0.5 |
| 2022-05-10 | 1.5 | 2.5 | 1.22 | 0.5 |
| 2022-05-11 | 1.5 | 2.5 | 1.21 | 0.5 |
| 2022-05-12 | 2 | 3 | 1.21 | 1 |
| 2022-05-13 | 2 | 3 | 1.21 | 1 |
| 2022-05-16 | 2 | 3 | 1.21 | 1 |
| 2022-05-17 | 2 | 3 | 1.21 | 1 |
| 2022-05-18 | 2 | 3 | 1.48 | 1 |
| 2022-05-19 | 2 | 3 | 1.48 | 1 |
| 2022-05-20 | 2 | 3 | 1.48 | 1 |
| 2022-05-23 | 2 | 3 | 1.48 | 1 |
| 2022-05-24 | 2 | 3 | 1.48 | 1 |
| 2022-05-25 | 2 | 3 | 1.4 | 1 |
| 2022-05-26 | 2 | 3 | 1.4 | 1 |
| 2022-05-27 | 2 | 3 | 1.4 | 1 |
| 2022-05-30 | 2 | 3 | 1.4 | 1 |
| 2022-05-31 | 2 | 3 | 1.4 | 1 |
| 2022-06-01 | 2 | 3 | 1.44 | 1 |
| 2022-06-02 | 2 | 3 | 1.44 | 1 |
| 2022-06-03 | 2 | 3 | 1.44 | 1 |
| 2022-06-06 | 2 | 3 | 1.44 | 1 |
| 2022-06-07 | 2 | 3 | 1.44 | 1 |
| 2022-06-08 | 2 | 3 | 1.45 | 1 |
| 2022-06-09 | 2.5 | 3.5 | 1.45 | 1.5 |
| 2022-06-10 | 2.5 | 3.5 | 1.45 | 1.5 |
| 2022-06-13 | 2.5 | 3.5 | 1.45 | 1.5 |
| 2022-06-14 | 2.5 | 3.5 | 1.45 | 1.5 |
| 2022-06-15 | 2.5 | 3.5 | 1.63 | 1.5 |
| 2022-06-16 | 2.5 | 3.5 | 1.63 | 1.5 |
| 2022-06-17 | 2.5 | 3.5 | 1.63 | 1.5 |
| 2022-06-20 | 2.5 | 3.5 | 1.63 | 1.5 |
| 2022-06-21 | 2.5 | 3.5 | 1.63 | 1.5 |
| 2022-06-22 | 2.5 | 3.5 | 1.66 | 1.5 |
| 2022-06-23 | 2.5 | 3.5 | 1.66 | 1.5 |
| 2022-06-24 | 2.5 | 3.5 | 1.66 | 1.5 |
| 2022-06-27 | 2.5 | 3.5 | 1.66 | 1.5 |
| 2022-06-28 | 2.5 | 3.5 | 1.66 | 1.5 |
| 2022-06-29 | 2.5 | 3.5 | 1.7 | 1.5 |
| 2022-06-30 | 2.5 | 3.5 | 1.7 | 1.5 |
| 2022-07-01 | 2.5 | 3.5 | 1.7 | 1.5 |
| 2022-07-04 | 2.5 | 3.5 | 1.7 | 1.5 |
| 2022-07-05 | 2.5 | 3.5 | 1.7 | 1.5 |
| 2022-07-06 | 2.5 | 3.5 | 1.7 | 1.5 |
| 2022-07-07 | 2.75 | 3.75 | 1.7 | 1.75 |
| 2022-07-08 | 2.75 | 3.75 | 1.7 | 1.75 |
| 2022-07-11 | 2.75 | 3.75 | 1.7 | 1.75 |
| 2022-07-12 | 2.75 | 3.75 | 1.7 | 1.75 |
| 2022-07-13 | 2.75 | 3.75 | 1.9 | 1.75 |
| 2022-07-14 | 2.75 | 3.75 | 1.9 | 1.75 |
| 2022-07-15 | 2.75 | 3.75 | 1.9 | 1.75 |
| 2022-07-18 | 2.75 | 3.75 | 1.9 | 1.75 |
| 2022-07-19 | 2.75 | 3.75 | 1.9 | 1.75 |
| 2022-07-20 | 2.75 | 3.75 | 1.95 | 1.75 |
| 2022-07-21 | 2.75 | 3.75 | 1.95 | 1.75 |
| 2022-07-22 | 2.75 | 3.75 | 1.95 | 1.75 |
| 2022-07-25 | 2.75 | 3.75 | 1.95 | 1.75 |
| 2022-07-26 | 2.75 | 3.75 | 1.95 | 1.75 |
| 2022-07-27 | 2.75 | 3.75 | 1.97 | 1.75 |
| 2022-07-28 | 2.75 | 3.75 | 1.97 | 1.75 |
| 2022-07-29 | 2.75 | 3.75 | 1.97 | 1.75 |
| 2022-08-01 | 2.75 | 3.75 | 1.97 | 1.75 |
| 2022-08-02 | 2.75 | 3.75 | 1.97 | 1.75 |
| 2022-08-03 | 2.75 | 3.75 | 1.99 | 1.75 |
| 2022-08-04 | 2.75 | 3.75 | 1.99 | 1.75 |
| 2022-08-05 | 2.75 | 3.75 | 1.99 | 1.75 |
| 2022-08-08 | 2.75 | 3.75 | 1.99 | 1.75 |
| 2022-08-09 | 2.75 | 3.75 | 1.99 | 1.75 |
| 2022-08-10 | 2.75 | 3.75 | 1.97 | 1.75 |
| 2022-08-11 | 3 | 4 | 1.97 | 2 |
| 2022-08-12 | 3 | 4 | 1.97 | 2 |
| 2022-08-15 | 3 | 4 | 1.97 | 2 |
| 2022-08-16 | 3 | 4 | 1.97 | 2 |
| 2022-08-17 | 3 | 4 | 2.19 | 2 |
| 2022-08-18 | 3 | 4 | 2.19 | 2 |
| 2022-08-19 | 3 | 4 | 2.19 | 2 |
| 2022-08-22 | 3 | 4 | 2.19 | 2 |
| 2022-08-23 | 3 | 4 | 2.19 | 2 |
| 2022-08-24 | 3 | 4 | 2.2 | 2 |
| 2022-08-25 | 3 | 4 | 2.2 | 2 |
| 2022-08-26 | 3 | 4 | 2.2 | 2 |
| 2022-08-29 | 3 | 4 | 2.2 | 2 |
| 2022-08-30 | 3 | 4 | 2.2 | 2 |
| 2022-08-31 | 3 | 4 | 2.19 | 2 |
| 2022-09-01 | 3 | 4 | 2.19 | 2 |
| 2022-09-02 | 3 | 4 | 2.19 | 2 |
| 2022-09-05 | 3 | 4 | 2.19 | 2 |
| 2022-09-06 | 3 | 4 | 2.19 | 2 |
| 2022-09-07 | 3 | 4 | 2.26 | 2 |
| 2022-09-08 | 3.5 | 4.5 | 2.26 | 2.5 |
| 2022-09-09 | 3.5 | 4.5 | 2.26 | 2.5 |
| 2022-09-12 | 3.5 | 4.5 | 2.26 | 2.5 |
| 2022-09-13 | 3.5 | 4.5 | 2.26 | 2.5 |
| 2022-09-14 | 3.5 | 4.5 | 2.65 | 2.5 |
| 2022-09-15 | 3.5 | 4.5 | 2.65 | 2.5 |
| 2022-09-16 | 3.5 | 4.5 | 2.65 | 2.5 |
| 2022-09-19 | 3.5 | 4.5 | 2.65 | 2.5 |
| 2022-09-20 | 3.5 | 4.5 | 2.65 | 2.5 |
| 2022-09-21 | 3.5 | 4.5 | 2.83 | 2.5 |
| 2022-09-22 | 3.5 | 4.5 | 2.83 | 2.5 |
| 2022-09-23 | 3.5 | 4.5 | 2.83 | 2.5 |
| 2022-09-26 | 3.5 | 4.5 | 2.83 | 2.5 |
| 2022-09-27 | 3.5 | 4.5 | 2.83 | 2.5 |
| 2022-09-28 | 3.5 | 4.5 | 2.84 | 2.5 |
| 2022-09-29 | 3.5 | 4.5 | 2.84 | 2.5 |
| 2022-09-30 | 3.5 | 4.5 | 2.84 | 2.5 |
| 2022-10-03 | 3.5 | 4.5 | 2.84 | 2.5 |
| 2022-10-04 | 3.5 | 4.5 | 2.84 | 2.5 |
| 2022-10-05 | 3.5 | 4.5 | 2.86 | 2.5 |
| 2022-10-06 | 4 | 5 | 2.86 | 3 |
| 2022-10-07 | 4 | 5 | 2.86 | 3 |
| 2022-10-10 | 4 | 5 | 2.86 | 3 |
| 2022-10-11 | 4 | 5 | 2.86 | 3 |
| 2022-10-12 | 4 | 5 | 3.12 | 3 |
| 2022-10-13 | 4 | 5 | 3.12 | 3 |
| 2022-10-14 | 4 | 5 | 3.12 | 3 |
| 2022-10-17 | 4 | 5 | 3.12 | 3 |
| 2022-10-18 | 4 | 5 | 3.12 | 3 |
| 2022-10-19 | 4 | 5 | 3.2 | 3 |
| 2022-10-20 | 4 | 5 | 3.2 | 3 |
| 2022-10-21 | 4 | 5 | 3.2 | 3 |
| 2022-10-24 | 4 | 5 | 3.2 | 3 |
| 2022-10-25 | 4 | 5 | 3.2 | 3 |
| 2022-10-26 | 4 | 5 | 3.2 | 3 |
| 2022-10-27 | 4 | 5 | 3.2 | 3 |
| 2022-10-28 | 4 | 5 | 3.2 | 3 |
| 2022-10-31 | 4 | 5 | 3.2 | 3 |
| 2022-11-01 | 4 | 5 | 3.2 | 3 |
| 2022-11-02 | 4 | 5 | 3.18 | 3 |
| 2022-11-03 | 4 | 5 | 3.18 | 3 |
| 2022-11-04 | 4 | 5 | 3.18 | 3 |
| 2022-11-07 | 4 | 5 | 3.18 | 3 |
| 2022-11-08 | 4 | 5 | 3.18 | 3 |
| 2022-11-09 | 4 | 5 | 3.29 | 3 |
| 2022-11-10 | 4.5 | 5.5 | 3.29 | 3.5 |